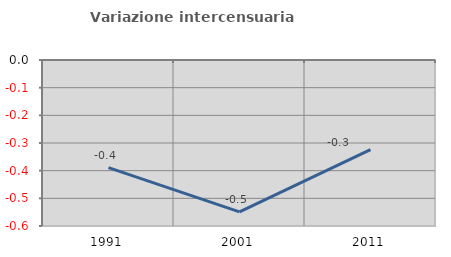
| Category | Variazione intercensuaria annua |
|---|---|
| 1991.0 | -0.389 |
| 2001.0 | -0.549 |
| 2011.0 | -0.324 |